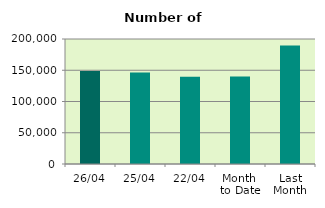
| Category | Series 0 |
|---|---|
| 26/04 | 148736 |
| 25/04 | 146322 |
| 22/04 | 139594 |
| Month 
to Date | 140033.375 |
| Last
Month | 189416.87 |